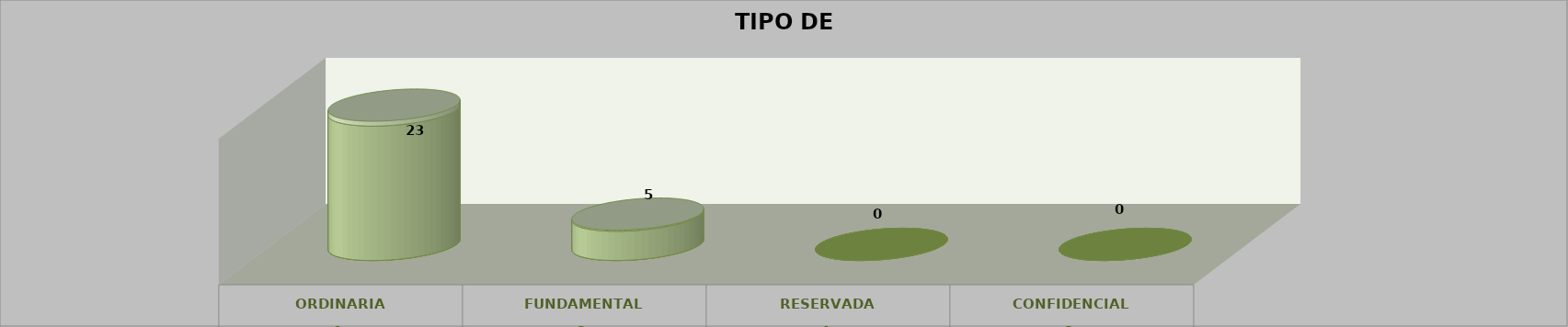
| Category | Series 0 | Series 2 | Series 1 | Series 3 | Series 4 |
|---|---|---|---|---|---|
| 0 |  |  |  | 23 | 0.821 |
| 1 |  |  |  | 5 | 0.179 |
| 2 |  |  |  | 0 | 0 |
| 3 |  |  |  | 0 | 0 |